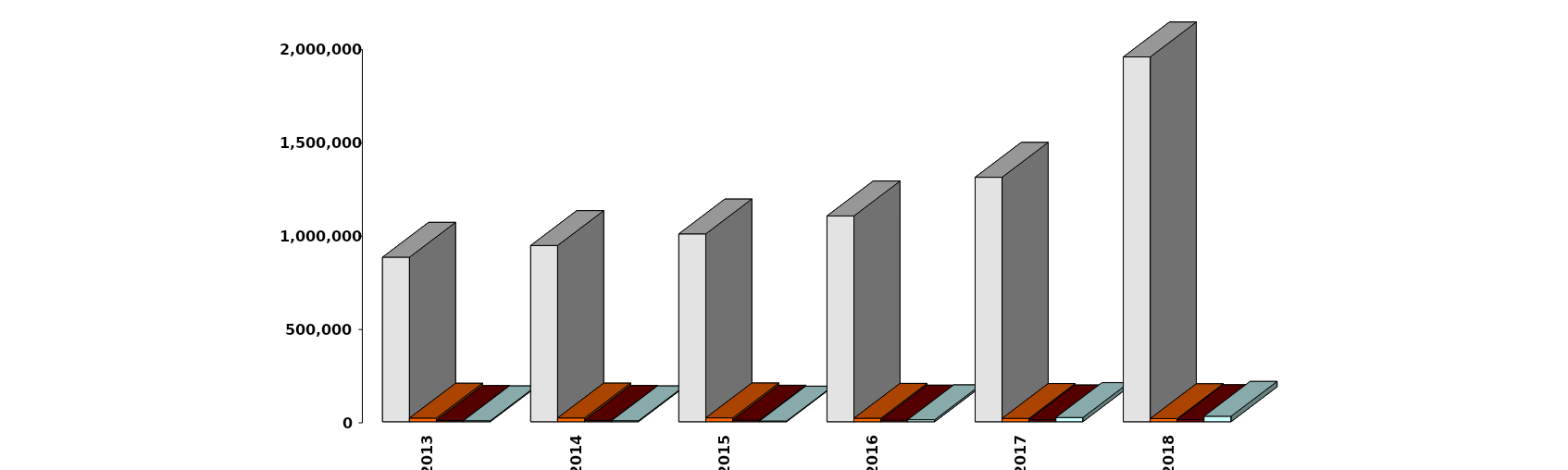
| Category | Физические лица | Юридические лица | Иностранные лица | Клиенты, передавшие свои средства в ДУ |
|---|---|---|---|---|
| 2013-12-31 | 881844 | 19539 | 6957 | 5182 |
| 2014-12-31 | 944559 | 20178 | 7486 | 5142 |
| 2015-12-31 | 1006751 | 20753 | 8729 | 3836 |
| 2016-12-31 | 1102966 | 18622 | 9215 | 10694 |
| 2017-12-31 | 1310296 | 17766 | 10211 | 22564 |
| 2018-12-31 | 1955118 | 16631 | 11453 | 29262 |